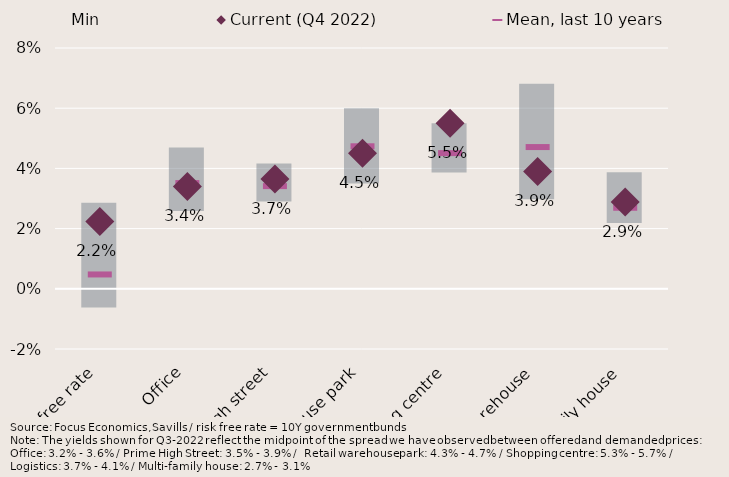
| Category | Min | Range min/max, last 10 years |
|---|---|---|
| Risk free rate | -0.006 | 0.029 |
| Office | 0.026 | 0.021 |
| Prime high street | 0.029 | 0.013 |
| Retail warehouse park | 0.035 | 0.025 |
| Shopping centre | 0.039 | 0.016 |
| Logistics warehouse | 0.03 | 0.038 |
| Multi-family house | 0.022 | 0.017 |